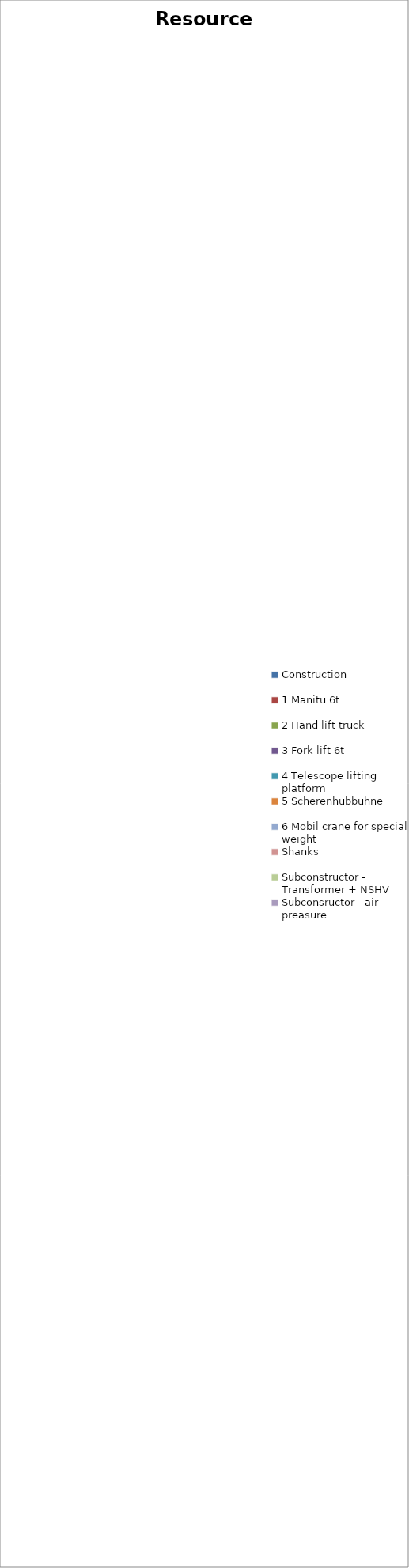
| Category | data |
|---|---|
| Construction | 0 |
| 1 Manitu 6t | 0 |
| 2 Hand lift truck | 0 |
| 3 Fork lift 6t | 0 |
| 4 Telescope lifting platform | 0 |
| 5 Scherenhubbuhne | 0 |
| 6 Mobil crane for special weight | 0 |
| Shanks | 0 |
| Subconstructor - Transformer + NSHV | 0 |
| Subconsructor - air preasure | 0 |